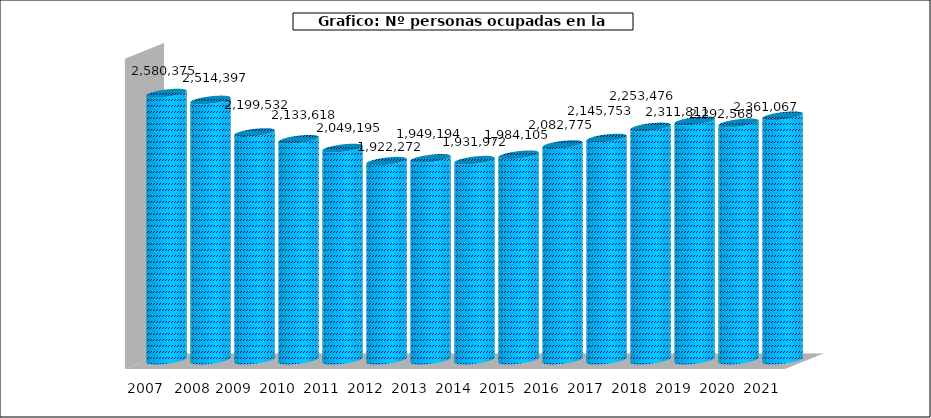
| Category |  Nº personas ocupadas |
|---|---|
| 2007 | 2580375 |
|  2008 * | 2514397 |
| 2009 | 2199532 |
| 2010 | 2133618 |
| 2011 | 2049195 |
| 2012 | 1922272 |
| 2013 | 1949194 |
| 2014 | 1931972 |
| 2015 | 1984105 |
| 2016 | 2082775 |
| 2017 | 2145753 |
| 2018 | 2253476 |
| 2019 | 2311811 |
| 2020 | 2292568 |
| 2021 | 2361067 |